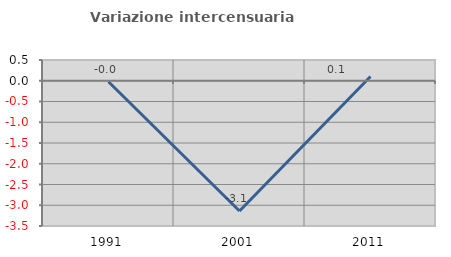
| Category | Variazione intercensuaria annua |
|---|---|
| 1991.0 | -0.023 |
| 2001.0 | -3.138 |
| 2011.0 | 0.104 |